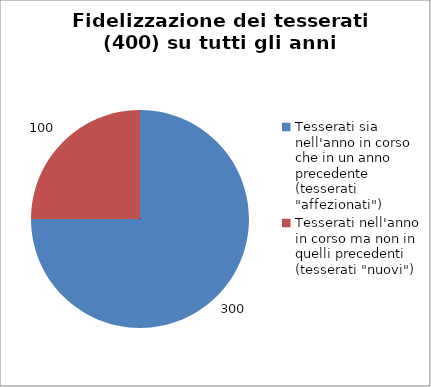
| Category | Nr. Tesserati |
|---|---|
| Tesserati sia nell'anno in corso che in un anno precedente (tesserati "affezionati") | 300 |
| Tesserati nell'anno in corso ma non in quelli precedenti (tesserati "nuovi") | 100 |